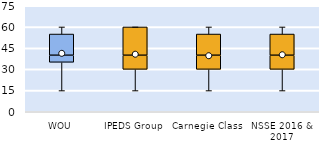
| Category | 25th | 50th | 75th |
|---|---|---|---|
| WOU | 35 | 5 | 15 |
| IPEDS Group | 30 | 10 | 20 |
| Carnegie Class | 30 | 10 | 15 |
| NSSE 2016 & 2017 | 30 | 10 | 15 |